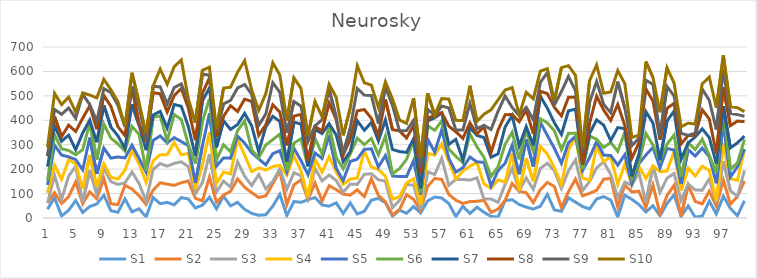
| Category | S1 | S2 | S3 | S4 | S5 | S6 | S7 | S8 | S9 | S10 |
|---|---|---|---|---|---|---|---|---|---|---|
| 0 | 35.836 | 25.402 | 0.232 | 41.319 | 32.48 | 20.125 | 54.724 | 42.872 | 2.571 | 33.997 |
| 1 | 82.797 | 20.925 | 70.963 | 41.58 | 81.711 | 43.187 | 35.765 | 38.149 | 29.209 | 65.845 |
| 2 | 8.304 | 51.048 | 16.906 | 82.33 | 98.935 | 25.458 | 31.399 | 18.799 | 91.168 | 39.676 |
| 3 | 31.402 | 56.093 | 84.101 | 66.579 | 12.28 | 26.01 | 62.874 | 40.684 | 70.341 | 44.79 |
| 4 | 71.297 | 76.302 | 63.473 | 10.778 | 17.225 | 19.648 | 20.758 | 74.673 | 54.28 | 25.308 |
| 5 | 22.424 | 36.087 | 6.758 | 53.562 | 78.647 | 82.385 | 68.523 | 60.45 | 97.398 | 5.973 |
| 6 | 47.044 | 59.832 | 88.351 | 62.219 | 71.5 | 60.358 | 11.792 | 57.805 | 5.39 | 39.029 |
| 7 | 57.212 | 21.852 | 19.486 | 29.713 | 52.264 | 58.323 | 70.96 | 53.597 | 33.442 | 94.815 |
| 8 | 93.31 | 68.342 | 41.183 | 19.241 | 64.018 | 98.72 | 76.732 | 40.376 | 27.827 | 37.749 |
| 9 | 29.842 | 28.465 | 90.706 | 18.689 | 77.401 | 81.535 | 45.682 | 84.899 | 55.891 | 11.882 |
| 10 | 23.181 | 31.858 | 82.33 | 21.366 | 91.366 | 53.603 | 32.38 | 37.612 | 87.854 | 14.706 |
| 11 | 78.408 | 55.726 | 9.689 | 52.271 | 49.815 | 28.5 | 10.979 | 52.201 | 34.89 | 1.023 |
| 12 | 25.173 | 93.275 | 69.962 | 85.855 | 23.637 | 77.162 | 90.389 | 70.045 | 2.629 | 56.184 |
| 13 | 37.718 | 53.485 | 50.188 | 80.955 | 22.57 | 97.336 | 38.83 | 6.048 | 71.65 | 13.903 |
| 14 | 4.359 | 51.094 | 12.397 | 77.81 | 42.566 | 6.189 | 83.362 | 33.187 | 5.227 | 30.609 |
| 15 | 83.825 | 30.235 | 84.913 | 35.279 | 83.14 | 95.757 | 8.382 | 91.783 | 25.106 | 1.843 |
| 16 | 58.442 | 85.895 | 78.642 | 35.924 | 77.31 | 81.31 | 19.02 | 71.953 | 28.709 | 72.569 |
| 17 | 63.96 | 74.503 | 73.853 | 46.654 | 48.517 | 8.715 | 52.248 | 65.301 | 33.094 | 80.597 |
| 18 | 53.808 | 79.798 | 89.779 | 85.803 | 19.697 | 94.401 | 41.421 | 36.237 | 33.102 | 85.481 |
| 19 | 83.592 | 60.847 | 85.545 | 28.804 | 54.106 | 90.75 | 53.836 | 73.188 | 18.373 | 97.702 |
| 20 | 78.039 | 73.693 | 58.2 | 54.457 | 31.683 | 4.817 | 73.555 | 75.766 | 26.628 | 11.198 |
| 21 | 40.998 | 39.845 | 18.206 | 18.987 | 26.275 | 78.625 | 32.332 | 63.393 | 71.438 | 1.331 |
| 22 | 52.528 | 17.67 | 74.244 | 73.605 | 77.908 | 99.082 | 84.039 | 31.544 | 77.672 | 16.253 |
| 23 | 85.109 | 82.407 | 94.35 | 88.82 | 77.424 | 60.207 | 44.588 | 40.328 | 11.353 | 32.648 |
| 24 | 37.655 | 26.717 | 41.539 | 33.932 | 72.557 | 26.265 | 50.607 | 43.977 | 24.651 | 6.013 |
| 25 | 88.892 | 4.865 | 57.387 | 37.169 | 57.678 | 54.154 | 98.085 | 18.012 | 50.745 | 64.623 |
| 26 | 49.712 | 59.516 | 17.584 | 53.46 | 64.59 | 25.867 | 91.855 | 97.15 | 21.853 | 53.926 |
| 27 | 64.222 | 95.997 | 69.917 | 91.358 | 13.725 | 22.459 | 25.167 | 53.219 | 96.445 | 64.156 |
| 28 | 35.68 | 90.417 | 45.159 | 86.219 | 48.518 | 91.463 | 30.997 | 57.998 | 60.089 | 97.763 |
| 29 | 18.829 | 84.925 | 29.103 | 57.099 | 77.47 | 11.748 | 98.389 | 99.631 | 29.218 | 17.936 |
| 30 | 11.225 | 72.511 | 93.857 | 27.294 | 37.112 | 4.77 | 24.873 | 66.474 | 41.28 | 61.44 |
| 31 | 13.223 | 77.196 | 29.185 | 76.816 | 21.127 | 81.085 | 74.428 | 8.309 | 43.816 | 83.479 |
| 32 | 48.371 | 91.76 | 9.687 | 60.941 | 52.425 | 57.67 | 95.36 | 47.4 | 89.989 | 81.858 |
| 33 | 96.547 | 96.131 | 8.688 | 13.945 | 60.214 | 67.918 | 51.84 | 37.886 | 81.351 | 70.884 |
| 34 | 10.279 | 45.343 | 62.347 | 57.624 | 13.423 | 6.275 | 34.756 | 67.175 | 50.844 | 51.301 |
| 35 | 67.567 | 68.193 | 49.976 | 69.14 | 30.685 | 20.806 | 85.944 | 24.681 | 60.116 | 96.702 |
| 36 | 64.167 | 92.356 | 16.454 | 19.982 | 42.401 | 89.338 | 59.972 | 39.706 | 33.782 | 72.75 |
| 37 | 74.897 | 0.84 | 9.796 | 2.039 | 89.51 | 31.901 | 3.958 | 21.223 | 79.878 | 23.926 |
| 38 | 83.772 | 60.32 | 58.855 | 38.148 | 25.09 | 59.08 | 36.602 | 12.7 | 2.954 | 99.426 |
| 39 | 53.468 | 15.959 | 82.629 | 35.312 | 56.686 | 18.712 | 82.849 | 10.422 | 45.834 | 12.518 |
| 40 | 48.485 | 83.605 | 43.563 | 75.258 | 87.474 | 36.709 | 11.119 | 84.246 | 56.532 | 20.687 |
| 41 | 61.987 | 54.448 | 37.416 | 35.218 | 15.087 | 43.515 | 91.949 | 63.91 | 9.852 | 80.547 |
| 42 | 18.3 | 79.174 | 7.9 | 32.258 | 15.733 | 48.257 | 29.037 | 27.08 | 7.062 | 73.401 |
| 43 | 61.643 | 32.056 | 45.049 | 20.688 | 72.007 | 29.952 | 10.735 | 51.486 | 43.631 | 82.329 |
| 44 | 16.626 | 99.155 | 21.612 | 26.436 | 76.963 | 85.825 | 71.504 | 40.614 | 91.772 | 92.66 |
| 45 | 27.31 | 59.918 | 91.292 | 95.544 | 7.076 | 19.343 | 58.682 | 84.732 | 59.709 | 50.107 |
| 46 | 72.665 | 87.825 | 20.842 | 27.525 | 74.436 | 42.173 | 65.35 | 17.369 | 93.679 | 41.99 |
| 47 | 80.359 | 12.102 | 64.042 | 41.692 | 10.673 | 49.714 | 57.186 | 24.028 | 46.563 | 66.182 |
| 48 | 62.349 | 4.116 | 84.118 | 20.449 | 84.787 | 79.641 | 66.349 | 83.377 | 51.273 | 20.58 |
| 49 | 7.232 | 5.467 | 29.604 | 34.228 | 95.64 | 8.82 | 99.699 | 80.898 | 99.324 | 26.425 |
| 50 | 32.24 | 2.416 | 37.081 | 15.506 | 82.43 | 32.34 | 69.903 | 84.766 | 0.183 | 44.628 |
| 51 | 19.263 | 76.52 | 40.677 | 7.297 | 26.026 | 70.204 | 28.498 | 59.302 | 30.455 | 28.956 |
| 52 | 47.064 | 29.447 | 58.397 | 25.379 | 74.132 | 83.547 | 6.67 | 54.058 | 21.122 | 90.463 |
| 53 | 20.948 | 10.178 | 2.848 | 19.532 | 42.467 | 6.045 | 19.771 | 59.48 | 23.457 | 41.47 |
| 54 | 70.122 | 59.177 | 59.773 | 74.963 | 58.876 | 54 | 20.245 | 12.713 | 35.144 | 65.268 |
| 55 | 85.886 | 76.109 | 16.091 | 79.711 | 12.221 | 88.92 | 51.033 | 8.783 | 1.529 | 1.698 |
| 56 | 81.876 | 75.906 | 86.523 | 59.289 | 57.762 | 36.056 | 33.312 | 0.461 | 27.276 | 30.496 |
| 57 | 59.359 | 37.347 | 37.051 | 98.196 | 12.132 | 38.418 | 19.128 | 74.449 | 74.215 | 36.525 |
| 58 | 5.977 | 66.905 | 85.091 | 1.386 | 28.576 | 64.173 | 69.688 | 31.133 | 7.837 | 39.087 |
| 59 | 48.306 | 11.223 | 98.543 | 34.198 | 13.73 | 20.471 | 10.638 | 88.741 | 34.074 | 39.118 |
| 60 | 18.337 | 48.846 | 87.855 | 57.371 | 37.274 | 94.888 | 25.757 | 19.043 | 80.398 | 71.833 |
| 61 | 44.213 | 24.234 | 96.108 | 62.61 | 2.135 | 62.126 | 46.757 | 5.945 | 21.337 | 30.2 |
| 62 | 23.487 | 49.268 | 4.752 | 61.517 | 89.145 | 19.761 | 81.143 | 44.849 | 5.622 | 45.66 |
| 63 | 5.88 | 16.967 | 55.091 | 43.784 | 8.898 | 40.299 | 77.889 | 18.616 | 94.671 | 80.727 |
| 64 | 4.173 | 32.483 | 27.599 | 91.842 | 37.834 | 16.079 | 52.417 | 97.338 | 77.345 | 46.632 |
| 65 | 70.961 | 1.503 | 65.085 | 9.308 | 77.279 | 77.414 | 70.843 | 50.05 | 76.861 | 24.582 |
| 66 | 74.913 | 66.214 | 62.408 | 62.722 | 31.802 | 52.872 | 68.751 | 4.154 | 28.618 | 81.33 |
| 67 | 55.034 | 53.923 | 2.391 | 1.201 | 66.554 | 61.122 | 54.538 | 99.5 | 25.121 | 2.891 |
| 68 | 44.602 | 58.756 | 60.463 | 80.116 | 78.332 | 36.146 | 15.644 | 67.632 | 11.418 | 61.111 |
| 69 | 36.465 | 26.784 | 54.071 | 32.97 | 60.443 | 62.484 | 24.67 | 47.424 | 56.974 | 85.645 |
| 70 | 48.146 | 67.645 | 87.26 | 90.606 | 98.197 | 13.99 | 92.661 | 20.362 | 36.394 | 46.012 |
| 71 | 96.821 | 48.612 | 78.489 | 37.431 | 76.672 | 51.686 | 59.771 | 60.012 | 85.623 | 16.138 |
| 72 | 32.979 | 95.978 | 64.323 | 11.734 | 80.09 | 71.699 | 32.765 | 63.098 | 10.191 | 17.321 |
| 73 | 27.451 | 15.198 | 78.632 | 16.138 | 86.212 | 56.071 | 62.341 | 75.712 | 99.636 | 98.2 |
| 74 | 82.842 | 25.318 | 85.474 | 85.242 | 29.662 | 37.972 | 92.468 | 55.285 | 85.33 | 44.107 |
| 75 | 64.955 | 94.208 | 79.087 | 93.921 | 1.919 | 12.619 | 98.944 | 48.717 | 26.647 | 63.055 |
| 76 | 46.814 | 43.827 | 21.41 | 52.45 | 29.754 | 5.805 | 17.443 | 0.449 | 52.194 | 17.188 |
| 77 | 37.048 | 63.97 | 48.165 | 4.49 | 93.997 | 87.661 | 10.766 | 42.099 | 85.356 | 88.755 |
| 78 | 77.715 | 35.716 | 92.29 | 87.677 | 19.929 | 9.11 | 79.248 | 96.824 | 60.492 | 68.076 |
| 79 | 87.665 | 71.059 | 70.86 | 1.016 | 26.794 | 31.399 | 91.37 | 61.752 | 23.191 | 45.817 |
| 80 | 73.4 | 89.005 | 16.042 | 73.606 | 3.888 | 53.749 | 7.694 | 81.796 | 31.973 | 84.47 |
| 81 | 3.27 | 41.235 | 37.871 | 55.234 | 78.808 | 56.251 | 97.43 | 94.958 | 92.879 | 45.739 |
| 82 | 93.415 | 41.746 | 11.702 | 72.975 | 39.305 | 92.044 | 14.807 | 12.262 | 71.9 | 99.807 |
| 83 | 76.264 | 30.603 | 27.429 | 3.673 | 1.243 | 23.372 | 7.994 | 73.864 | 52.234 | 33.292 |
| 84 | 55.126 | 54.671 | 76.133 | 25.734 | 10.491 | 4.244 | 33.015 | 48.345 | 18.322 | 12.644 |
| 85 | 24.76 | 18.546 | 19.721 | 99.177 | 95.67 | 88.36 | 88.946 | 93.147 | 35.926 | 76.12 |
| 86 | 50.093 | 85.414 | 77.93 | 0.261 | 75.475 | 9.495 | 89.948 | 90.395 | 68.06 | 28.205 |
| 87 | 8.948 | 7.649 | 88.421 | 84.046 | 17.137 | 31.475 | 0.182 | 82.742 | 17.335 | 95.005 |
| 88 | 59.136 | 33.153 | 70.909 | 29.183 | 92.698 | 17.223 | 95.346 | 51.673 | 89.054 | 76.574 |
| 89 | 95.132 | 38.376 | 48.737 | 89.395 | 6.221 | 61.911 | 97.644 | 32.119 | 30.051 | 52.879 |
| 90 | 6.821 | 0.57 | 64.123 | 40.614 | 27.228 | 29.368 | 72.248 | 62.406 | 43.05 | 26.657 |
| 91 | 49.397 | 85.857 | 3.922 | 66.193 | 74.627 | 27.477 | 0.021 | 29.809 | 1.305 | 49.905 |
| 92 | 3.291 | 64.557 | 46.908 | 56.924 | 81.757 | 26.816 | 51.19 | 7.196 | 8.435 | 37.228 |
| 93 | 7.804 | 49.882 | 55.946 | 98.584 | 73.719 | 36.498 | 42.72 | 77.818 | 84.927 | 21.251 |
| 94 | 69.081 | 40.667 | 50.663 | 34.504 | 56.281 | 5.047 | 73.153 | 75.994 | 76.443 | 95.169 |
| 95 | 16.538 | 32.009 | 14.11 | 6.989 | 72.488 | 43.743 | 36.834 | 41.952 | 97.528 | 89.519 |
| 96 | 89.27 | 65.536 | 78.457 | 73.54 | 83.456 | 62.902 | 4.373 | 77.38 | 72.334 | 58.372 |
| 97 | 38.922 | 17.669 | 54.289 | 49.69 | 7.167 | 31.214 | 87.947 | 91.094 | 50.261 | 28.184 |
| 98 | 9.746 | 78.586 | 0.503 | 65.059 | 55.487 | 16.067 | 82.183 | 89.047 | 26.479 | 28.114 |
| 99 | 70.702 | 80.737 | 43.538 | 85.321 | 1.7 | 39.628 | 13.66 | 59.102 | 22.033 | 19.22 |